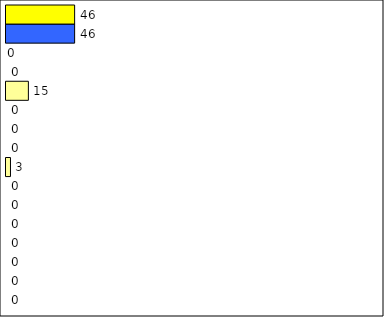
| Category | -2 | -1 | 0 | 1 | 2 | 3 | 4 | 5 | 6 | 7 | 8 | 9 | 10 | 11 | 12 | Perfect Round |
|---|---|---|---|---|---|---|---|---|---|---|---|---|---|---|---|---|
| 0 | 0 | 0 | 0 | 0 | 0 | 0 | 0 | 3 | 0 | 0 | 0 | 15 | 0 | 0 | 46 | 46 |